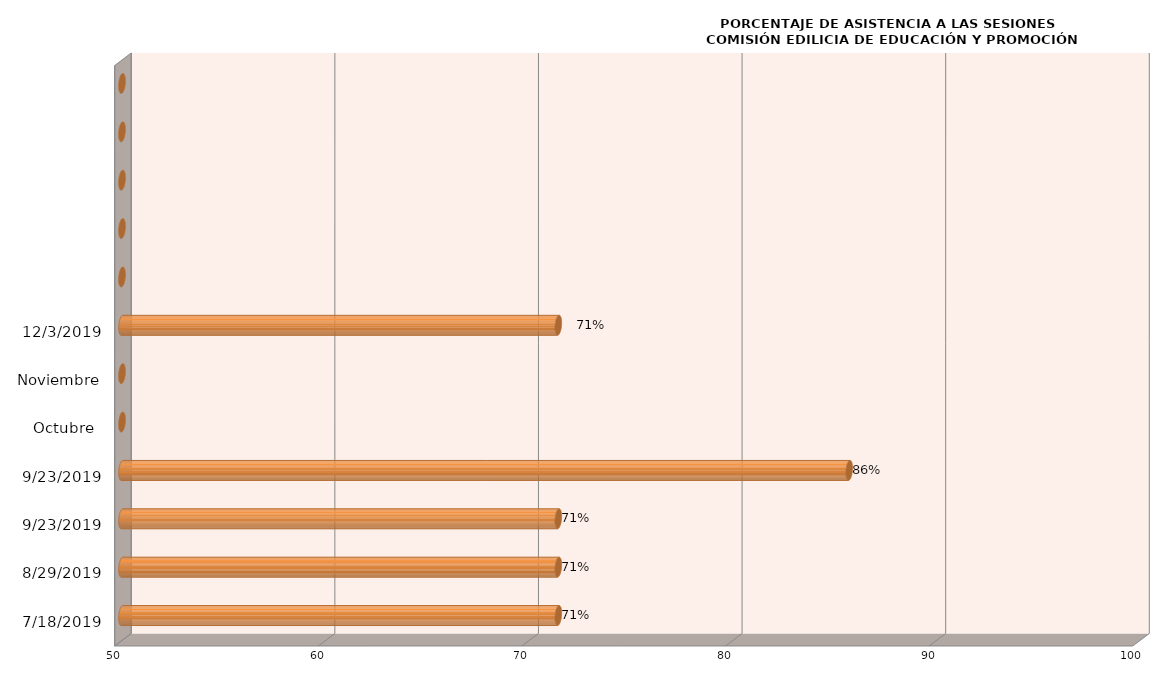
| Category | Series 0 |
|---|---|
| 18/07/2019 | 71.429 |
| 29/08/2019 | 71.429 |
| 23/09/2019 | 71.429 |
| 23/09/2019 | 85.714 |
| Octubre  | 0 |
| Noviembre | 0 |
| 03/12/2019 | 71.429 |